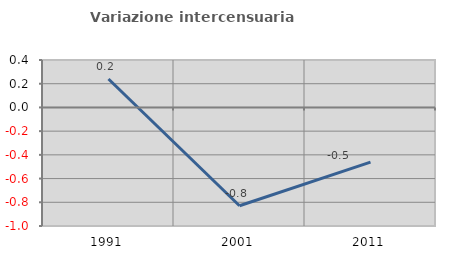
| Category | Variazione intercensuaria annua |
|---|---|
| 1991.0 | 0.24 |
| 2001.0 | -0.829 |
| 2011.0 | -0.461 |